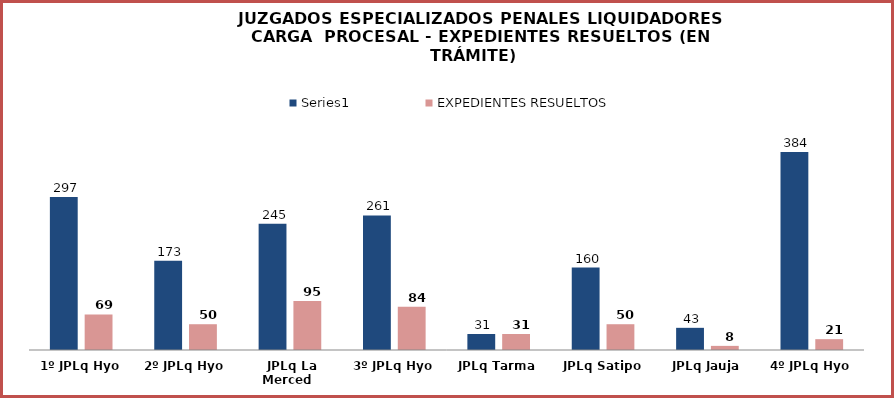
| Category | Series 0 | EXPEDIENTES RESUELTOS |
|---|---|---|
| 1º JPLq Hyo | 297 | 69 |
| 2º JPLq Hyo | 173 | 50 |
| JPLq La Merced | 245 | 95 |
| 3º JPLq Hyo | 261 | 84 |
| JPLq Tarma | 31 | 31 |
| JPLq Satipo | 160 | 50 |
| JPLq Jauja | 43 | 8 |
| 4º JPLq Hyo | 384 | 21 |